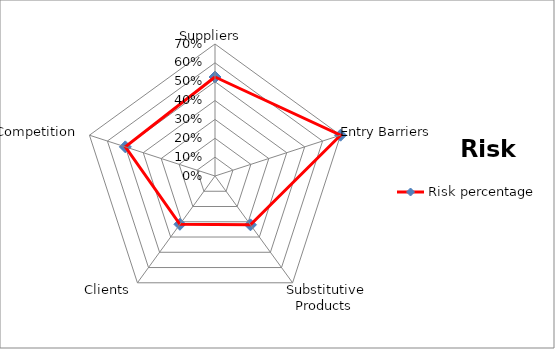
| Category | Risk percentage |
|---|---|
| Suppliers  | 0.525 |
| Entry Barriers   | 0.7 |
| Substitutive Products  | 0.32 |
| Clients   | 0.317 |
| Competition   | 0.5 |